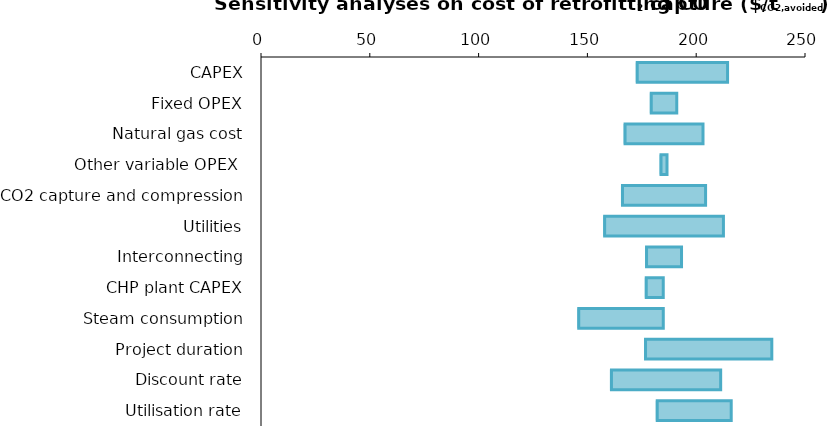
| Category | Minimum value | Increase of the parameter |
|---|---|---|
| CAPEX | 172.211 | 42.204 |
| Fixed OPEX | 178.684 | 12.375 |
| Natural gas cost | 166.619 | 36.505 |
| Other variable OPEX  | 183.135 | 3.474 |
| CO2 capture and compression | 165.434 | 38.876 |
| Utilities | 157.231 | 55.281 |
| Interconnecting | 176.488 | 16.767 |
| CHP plant CAPEX | 176.359 | 8.513 |
| Steam consumption | 145.33 | 39.542 |
| Project duration | 176.025 | 58.719 |
| Discount rate | 160.359 | 50.883 |
| Utilisation rate | 181.403 | 34.688 |